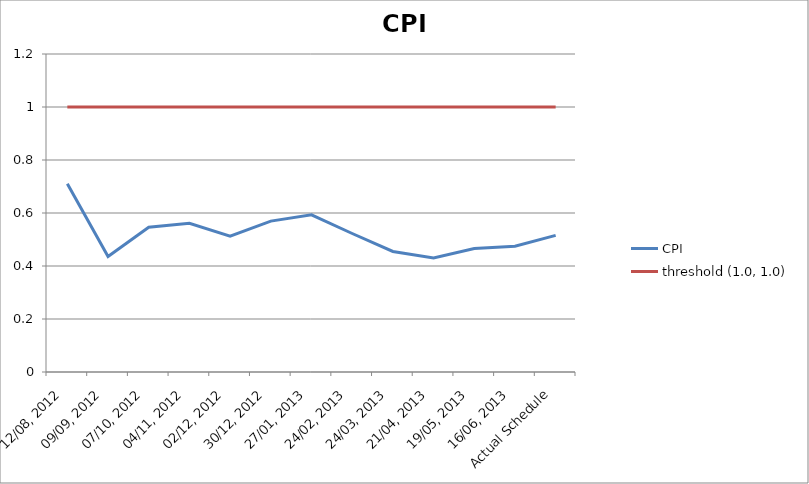
| Category | CPI | threshold (1.0, 1.0) |
|---|---|---|
| 12/08, 2012 | 0.71 | 1 |
| 09/09, 2012 | 0.436 | 1 |
| 07/10, 2012 | 0.546 | 1 |
| 04/11, 2012 | 0.561 | 1 |
| 02/12, 2012 | 0.513 | 1 |
| 30/12, 2012 | 0.569 | 1 |
| 27/01, 2013 | 0.593 | 1 |
| 24/02, 2013 | 0.523 | 1 |
| 24/03, 2013 | 0.455 | 1 |
| 21/04, 2013 | 0.43 | 1 |
| 19/05, 2013 | 0.466 | 1 |
| 16/06, 2013 | 0.475 | 1 |
| Actual Schedule | 0.516 | 1 |